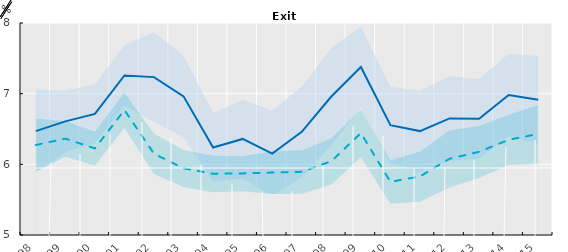
| Category | Highly digital-intensive sectors | Other sectors |
|---|---|---|
| 1998.0 | 6.47 | 6.274 |
| 1999.0 | 6.608 | 6.363 |
| 2000.0 | 6.714 | 6.225 |
| 2001.0 | 7.258 | 6.768 |
| 2002.0 | 7.234 | 6.15 |
| 2003.0 | 6.962 | 5.944 |
| 2004.0 | 6.238 | 5.867 |
| 2005.0 | 6.36 | 5.872 |
| 2006.0 | 6.152 | 5.883 |
| 2007.0 | 6.459 | 5.894 |
| 2008.0 | 6.96 | 6.044 |
| 2009.0 | 7.377 | 6.442 |
| 2010.0 | 6.555 | 5.753 |
| 2011.0 | 6.47 | 5.829 |
| 2012.0 | 6.65 | 6.079 |
| 2013.0 | 6.645 | 6.177 |
| 2014.0 | 6.982 | 6.347 |
| 2015.0 | 6.915 | 6.43 |